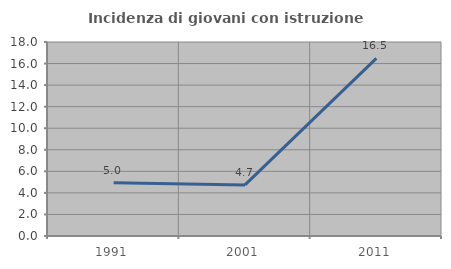
| Category | Incidenza di giovani con istruzione universitaria |
|---|---|
| 1991.0 | 4.95 |
| 2001.0 | 4.739 |
| 2011.0 | 16.479 |